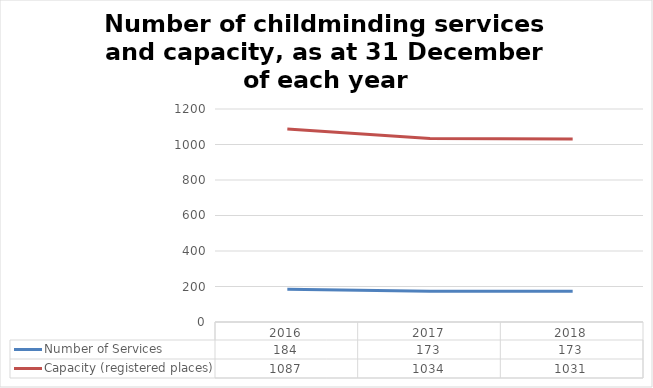
| Category | Number of Services | Capacity (registered places) |
|---|---|---|
| 2016.0 | 184 | 1087 |
| 2017.0 | 173 | 1034 |
| 2018.0 | 173 | 1031 |